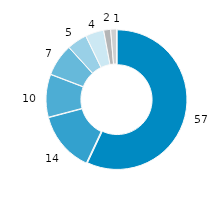
| Category | Hessen |
|---|---|
| gesetzliche
Kranken-versicherung | 56.986 |
| private Haushalte u. private Organi-sationen o. E. | 13.918 |
| private
Kranken-versicherung | 9.909 |
| soziale Pflegeversicherung | 7.422 |
| öffentliche Haushalte | 4.608 |
| Arbeitgeber | 4.233 |
| gesetzliche Unfallversicherung | 1.594 |
| gesetzliche
Renten-
versicherung | 1.333 |